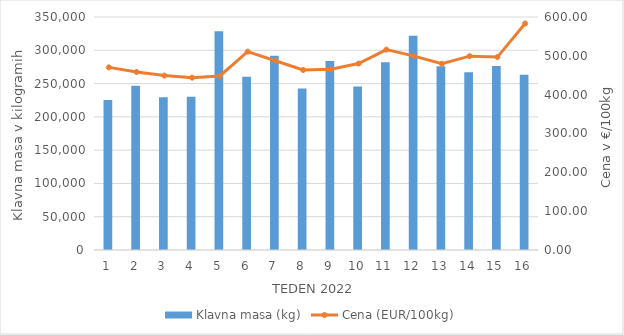
| Category | Klavna masa (kg) |
|---|---|
| 1.0 | 225300 |
| 2.0 | 246712 |
| 3.0 | 229541 |
| 4.0 | 230074 |
| 5.0 | 328640 |
| 6.0 | 260108 |
| 7.0 | 291887 |
| 8.0 | 242732 |
| 9.0 | 283987 |
| 10.0 | 245414 |
| 11.0 | 282092 |
| 12.0 | 321936 |
| 13.0 | 275950 |
| 14.0 | 267148 |
| 15.0 | 276417 |
| 16.0 | 263098 |